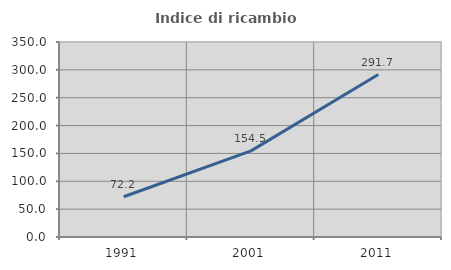
| Category | Indice di ricambio occupazionale  |
|---|---|
| 1991.0 | 72.222 |
| 2001.0 | 154.545 |
| 2011.0 | 291.667 |